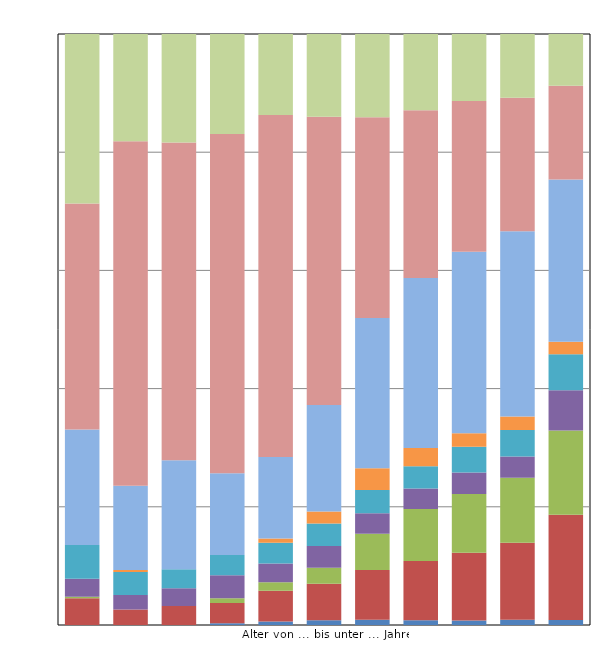
| Category | Verlust oder Teilverlust von Gliedm. | Funktionseinschränkung v. Gliedm. | Funktionseinschr.d.Wirbelsäule u.d.Rumpfes,… | Blindheit und Sehbehinderung | Sprach- oder Sprechstörungen, Taubheit, … | Verlust einer Brust o.beider Brüste,Entstellungen u.a. | Beeinträchtigung der Funktion von inneren Organen bzw. Organsystemen | Querschnittlähmung, zerebrale Störungen, geistig-seelische … | Sonstige und ungenügend bezeichnete Behinderungen |
|---|---|---|---|---|---|---|---|---|---|
| unter 6 | 0 | 37 | 2 | 25 | 47 | 0 | 160 | 313 | 235 |
| 6 - 15 | 0 | 81 | 0 | 77 | 121 | 10 | 443 | 1810 | 563 |
| 15 - 18 | 0 | 38 | 0 | 36 | 38 | 0 | 219 | 638 | 218 |
| 18 - 25 | 8 | 92 | 21 | 104 | 92 | 0 | 370 | 1535 | 452 |
| 25 - 35 | 38 | 345 | 97 | 211 | 233 | 48 | 913 | 3840 | 908 |
| 35 - 45 | 85 | 642 | 283 | 382 | 398 | 211 | 1878 | 5087 | 1459 |
| 45 - 55 | 177 | 1710 | 1241 | 704 | 793 | 751 | 5151 | 6886 | 2852 |
| 55 - 60 | 165 | 2116 | 1858 | 731 | 793 | 647 | 6059 | 5982 | 2718 |
| 60 - 62 | 78 | 1190 | 1030 | 381 | 449 | 240 | 3185 | 2647 | 1174 |
| 62 - 65 | 155 | 2302 | 1944 | 637 | 788 | 408 | 5540 | 3986 | 1908 |
| 65 und mehr | 940 | 19779 | 15803 | 7537 | 6787 | 2329 | 30452 | 17586 | 9736 |